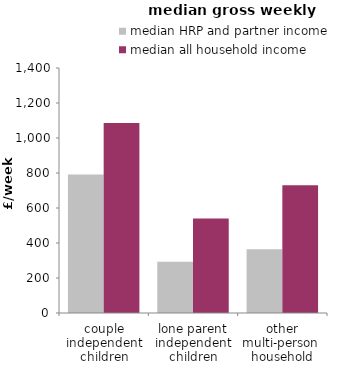
| Category | median HRP and partner income  | median all household income  |
|---|---|---|
| couple independent children | 790.8 | 1085.581 |
| lone parent independent children | 292.885 | 540 |
| other multi-person  household | 365 | 730 |